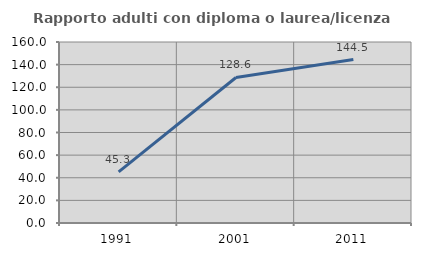
| Category | Rapporto adulti con diploma o laurea/licenza media  |
|---|---|
| 1991.0 | 45.261 |
| 2001.0 | 128.65 |
| 2011.0 | 144.524 |